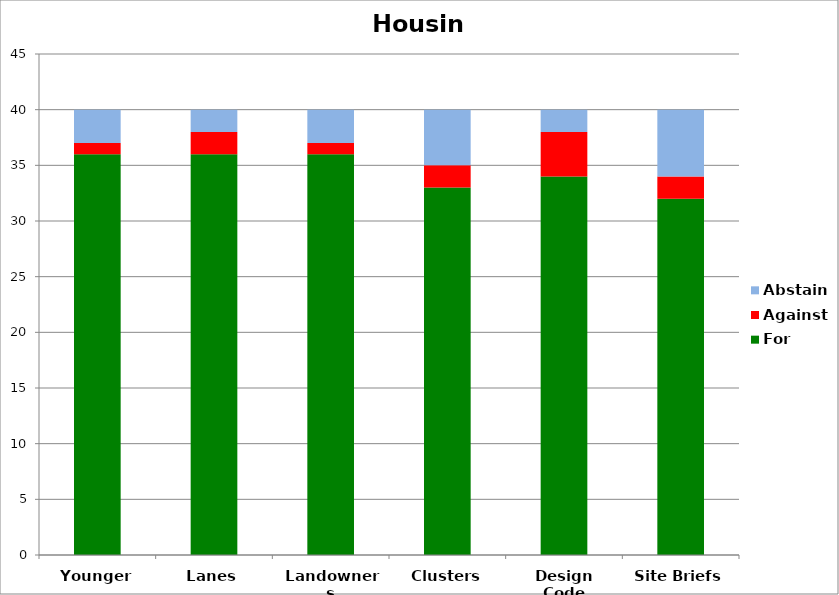
| Category | For | Against | Abstain |
|---|---|---|---|
| Younger | 36 | 1 | 3 |
| Lanes | 36 | 2 | 2 |
| Landowners | 36 | 1 | 3 |
| Clusters | 33 | 2 | 5 |
| Design Code | 34 | 4 | 2 |
| Site Briefs | 32 | 2 | 6 |